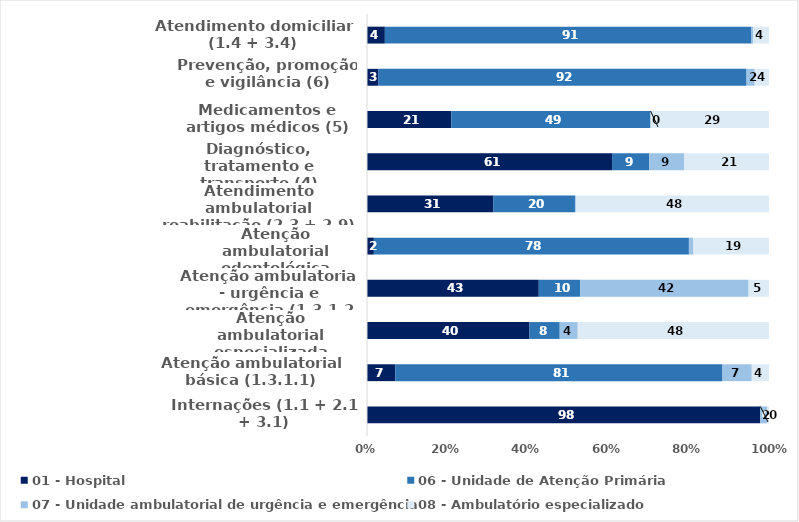
| Category | 01 - Hospital | 06 - Unidade de Atenção Primária | 07 - Unidade ambulatorial de urgência e emergência | 08 - Ambulatório especializado |
|---|---|---|---|---|
| Internações (1.1 + 2.1 + 3.1) | 97.832 | 0.008 | 1.717 | 0.443 |
| Atenção ambulatorial básica (1.3.1.1) | 7.016 | 81.414 | 7.282 | 4.288 |
| Atenção ambulatorial especializada (1.3.3.1) | 40.423 | 7.517 | 4.482 | 47.578 |
| Atenção ambulatorial - urgência e emergência (1.3.1.2 + 1.3.3.2) | 42.726 | 10.351 | 41.852 | 5.071 |
| Atenção ambulatorial odontológica (1.3.2) | 1.702 | 78.373 | 1.122 | 18.804 |
| Atendimento ambulatorial reabilitação (2.3 + 2.9) | 31.392 | 20.34 | 0.231 | 48.038 |
| Diagnóstico, tratamento e transporte (4) | 60.958 | 9.247 | 8.654 | 21.141 |
| Medicamentos e artigos médicos (5) | 21.002 | 49.459 | 0.152 | 29.388 |
| Prevenção, promoção e vigilância (6) | 2.776 | 91.638 | 2.034 | 3.552 |
| Atendimento domiciliar (1.4 + 3.4) | 4.442 | 91.208 | 0.39 | 3.96 |